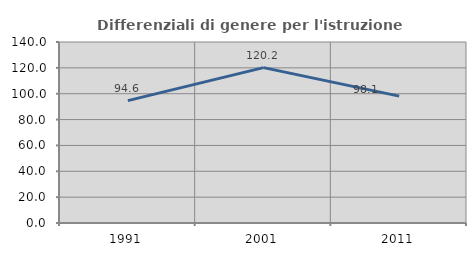
| Category | Differenziali di genere per l'istruzione superiore |
|---|---|
| 1991.0 | 94.627 |
| 2001.0 | 120.192 |
| 2011.0 | 98.135 |